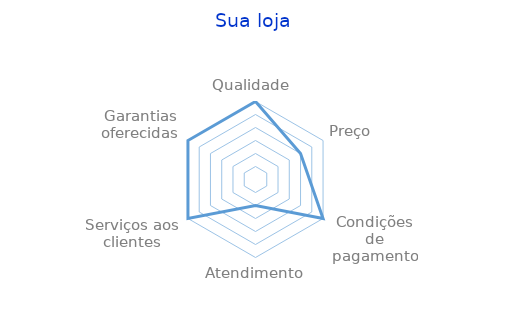
| Category | Series 0 |
|---|---|
| Qualidade  | 3 |
| Preço | 2 |
| Condições de pagamento | 3 |
| Atendimento | 1 |
| Serviços aos clientes | 3 |
| Garantias oferecidas | 3 |